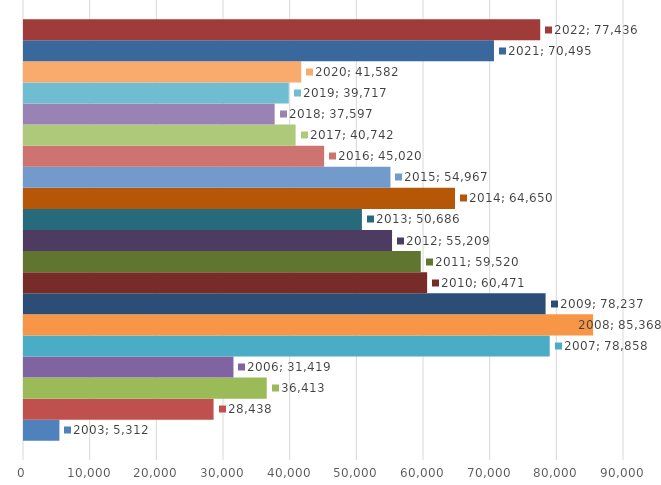
| Category | 2003 | 2004 | 2005 | 2006 | 2007 | 2008 | 2009 | 2010 | 2011 | 2012 | 2013 | 2014 | 2015 | 2016 | 2017 | 2018 | 2019 | 2020 | 2021 | 2022 |
|---|---|---|---|---|---|---|---|---|---|---|---|---|---|---|---|---|---|---|---|---|
| 0 | 5312 | 28438 | 36413 | 31419 | 78858 | 85368 | 78237 | 60471 | 59520 | 55209 | 50686 | 64650 | 54967 | 45020 | 40742 | 37597 | 39717 | 41582 | 70495 | 77436 |